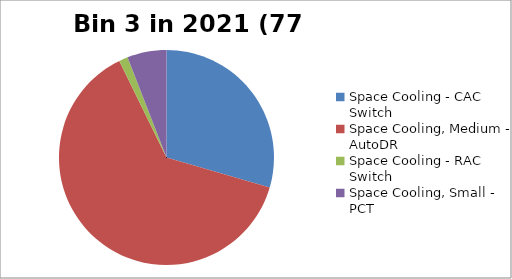
| Category | Series 0 |
|---|---|
| Space Cooling - CAC Switch | 0.027 |
| Space Cooling, Medium - AutoDR | 0.058 |
| Space Cooling - RAC Switch | 0.001 |
| Space Cooling, Small - PCT | 0.005 |